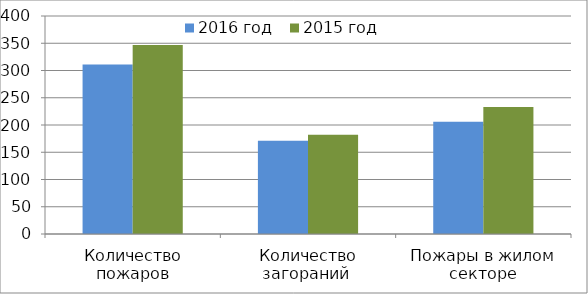
| Category | 2016 год | 2015 год |
|---|---|---|
| Количество пожаров | 311 | 347 |
| Количество загораний  | 171 | 182 |
| Пожары в жилом секторе | 206 | 233 |